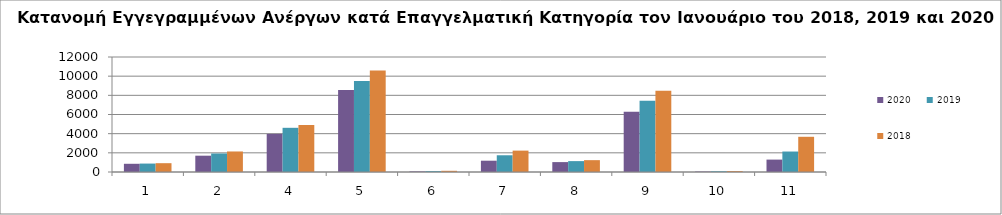
| Category | 2020 | 2019 | 2018 |
|---|---|---|---|
| 1.0 | 857 | 880 | 920 |
| 2.0 | 1702 | 1931 | 2142 |
| 4.0 | 3980 | 4611 | 4902 |
| 5.0 | 8556 | 9498 | 10599 |
| 6.0 | 61 | 92 | 125 |
| 7.0 | 1179 | 1746 | 2231 |
| 8.0 | 1033 | 1136 | 1236 |
| 9.0 | 6279 | 7430 | 8486 |
| 10.0 | 46 | 74 | 94 |
| 11.0 | 1294 | 2136 | 3674 |